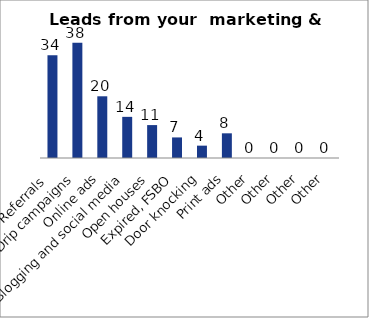
| Category | Series 0 |
|---|---|
| Referrals  | 34 |
| Drip campaigns  | 38.08 |
| Online ads  | 20.4 |
| Blogging and social media | 13.6 |
| Open houses | 10.88 |
| Expired, FSBO | 6.8 |
| Door knocking | 4.08 |
| Print ads | 8.16 |
| Other | 0 |
| Other | 0 |
| Other | 0 |
| Other | 0 |